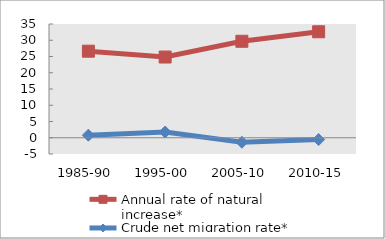
| Category | Annual rate of natural increase* | Crude net migration rate* |
|---|---|---|
| 1985-90 | 26.631 | 0.779 |
| 1995-00 | 24.837 | 1.763 |
| 2005-10 | 29.684 | -1.377 |
| 2010-15 | 32.608 | -0.557 |